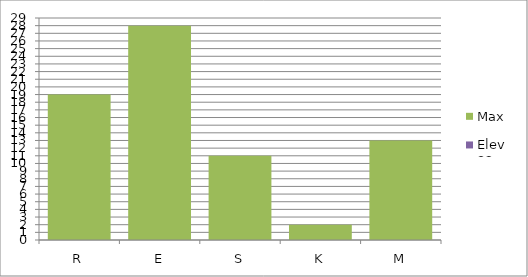
| Category | Max | Elev 32 |
|---|---|---|
| R | 19 | 0 |
| E | 28 | 0 |
| S | 11 | 0 |
| K | 2 | 0 |
| M | 13 | 0 |